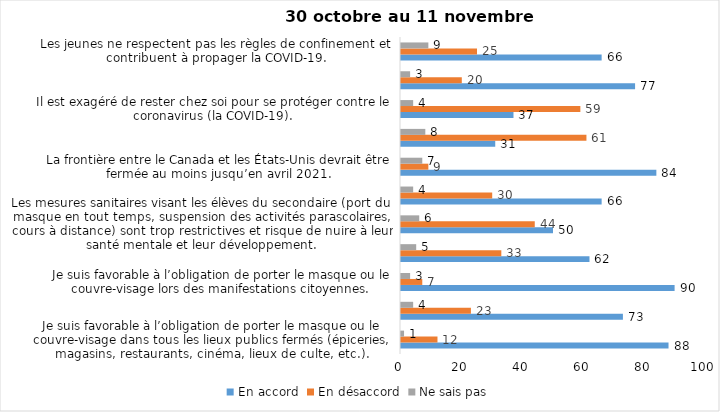
| Category | En accord | En désaccord | Ne sais pas |
|---|---|---|---|
| Je suis favorable à l’obligation de porter le masque ou le couvre-visage dans tous les lieux publics fermés (épiceries, magasins, restaurants, cinéma, lieux de culte, etc.). | 88 | 12 | 1 |
| C’est une bonne chose que les policiers puissent donner facilement des contraventions aux gens qui ne respectent pas les mesures pour prévenir le coronavirus (la COVID-19). | 73 | 23 | 4 |
| Je suis favorable à l’obligation de porter le masque ou le couvre-visage lors des manifestations citoyennes. | 90 | 7 | 3 |
| C’est une bonne chose d’arrêter les activités sportives de groupe (ex. hockey, soccer, yoga, etc.) et de fermer les centres d’entraînement (gyms) dans les zones rouges. | 62 | 33 | 5 |
| Les mesures sanitaires visant les élèves du secondaire (port du masque en tout temps, suspension des activités parascolaires, cours à distance) sont trop restrictives et risque de nuire à leur santé mentale et leur développement. | 50 | 44 | 6 |
| Je suis favorable à l’obligation de porter le masque ou le couvre-visage en tout temps pour les élèves au secondaire. | 66 | 30 | 4 |
| La frontière entre le Canada et les États-Unis devrait être fermée au moins jusqu’en avril 2021. | 84 | 9 | 7 |
| Le gouvernement et les médias exagèrent par rapport au coronavirus (la COVID-19). | 31 | 61 | 8 |
| Il est exagéré de rester chez soi pour se protéger contre le coronavirus (la COVID-19). | 37 | 59 | 4 |
| J’ai peur que le système de santé soit débordé par les cas de COVID-19 suite au «déconfinement». | 77 | 20 | 3 |
| Les jeunes ne respectent pas les règles de confinement et contribuent à propager la COVID-19. | 66 | 25 | 9 |